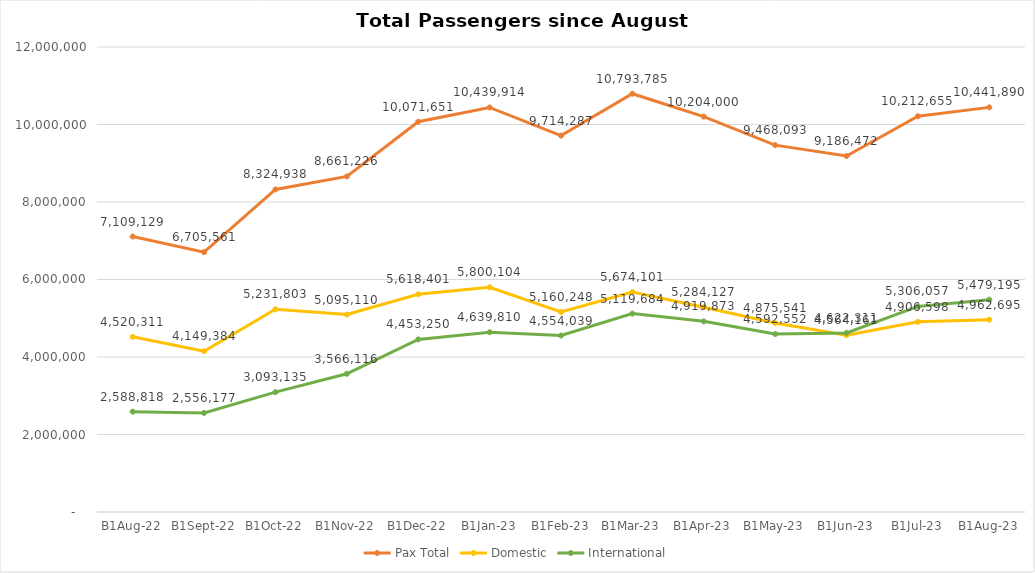
| Category | Pax Total | Domestic | International |
|---|---|---|---|
| 2022-08-01 | 7109129 | 4520311 | 2588818 |
| 2022-09-01 | 6705561 | 4149384 | 2556177 |
| 2022-10-01 | 8324938 | 5231803 | 3093135 |
| 2022-11-01 | 8661226 | 5095110 | 3566116 |
| 2022-12-01 | 10071651 | 5618401 | 4453250 |
| 2023-01-01 | 10439914 | 5800104 | 4639810 |
| 2023-02-01 | 9714287 | 5160248 | 4554039 |
| 2023-03-01 | 10793785 | 5674101 | 5119684 |
| 2023-04-01 | 10204000 | 5284127 | 4919873 |
| 2023-05-01 | 9468093 | 4875541 | 4592552 |
| 2023-06-01 | 9186472 | 4564161 | 4622311 |
| 2023-07-01 | 10212655 | 4906598 | 5306057 |
| 2023-08-01 | 10441890 | 4962695 | 5479195 |